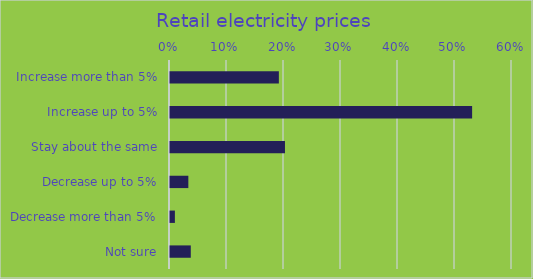
| Category | Series 0 |
|---|---|
| Increase more than 5% | 0.191 |
| Increase up to 5% | 0.53 |
| Stay about the same | 0.202 |
| Decrease up to 5% | 0.032 |
| Decrease more than 5% | 0.009 |
| Not sure | 0.036 |